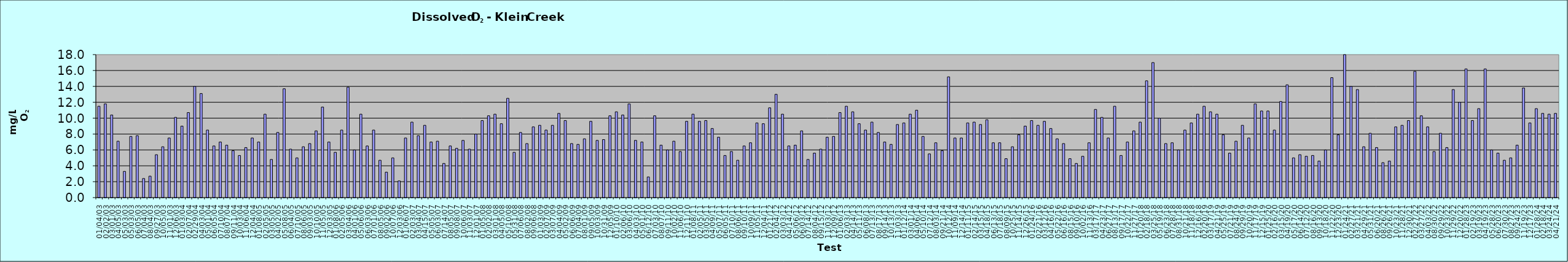
| Category | Series 0 |
|---|---|
| 2003-01-04 | 11.5 |
| 2003-02-02 | 11.8 |
| 2003-03-01 | 10.4 |
| 2003-04-05 | 7.1 |
| 2003-05-03 | 3.3 |
| 2003-05-03 | 7.7 |
| 2003-06-05 | 7.8 |
| 2003-07-04 | 2.4 |
| 2003-08-04 | 2.7 |
| 2003-09-27 | 5.4 |
| 2003-10-05 | 6.4 |
| 2003-11-01 | 7.5 |
| 2003-12-06 | 10.1 |
| 2004-01-03 | 9 |
| 2004-02-07 | 10.7 |
| 2004-02-29 | 14 |
| 2004-04-03 | 13.1 |
| 2004-05-01 | 8.5 |
| 2004-06-05 | 6.5 |
| 2004-07-10 | 7 |
| 2004-08-07 | 6.6 |
| 2004-09-11 | 5.9 |
| 2004-10-03 | 5.3 |
| 2004-11-06 | 6.3 |
| 2004-12-04 | 7.5 |
| 2005-01-08 | 7 |
| 2005-02-05 | 10.5 |
| 2005-03-05 | 4.8 |
| 2005-04-02 | 8.2 |
| 2005-05-08 | 13.7 |
| 2005-06-04 | 6.1 |
| 2005-07-10 | 5 |
| 2005-08-06 | 6.4 |
| 2005-09-03 | 6.8 |
| 2005-10-10 | 8.4 |
| 2005-11-05 | 11.4 |
| 2005-12-03 | 7 |
| 2006-01-08 | 5.7 |
| 2006-02-05 | 8.5 |
| 2006-03-04 | 13.9 |
| 2006-04-01 | 6 |
| 2006-05-06 | 10.5 |
| 2006-06-03 | 6.5 |
| 2006-07-01 | 8.5 |
| 2006-08-05 | 4.7 |
| 2006-09-02 | 3.2 |
| 2006-10-07 | 5 |
| 2006-12-03 | 2.1 |
| 2007-01-06 | 7.5 |
| 2007-02-03 | 9.5 |
| 2007-03-04 | 7.8 |
| 2007-04-15 | 9.1 |
| 2007-05-05 | 7 |
| 2007-06-03 | 7.1 |
| 2007-07-14 | 4.3 |
| 2007-08-05 | 6.5 |
| 2007-09-08 | 6.2 |
| 2007-10-06 | 7.2 |
| 2007-11-03 | 6.1 |
| 2007-12-01 | 8 |
| 2008-01-05 | 9.7 |
| 2008-02-02 | 10.3 |
| 2008-03-01 | 10.5 |
| 2008-04-05 | 9.3 |
| 2008-05-10 | 12.5 |
| 2008-05-31 | 5.7 |
| 2008-07-06 | 8.2 |
| 2008-08-02 | 6.8 |
| 2008-09-06 | 8.9 |
| 2009-01-03 | 9.1 |
| 2009-02-07 | 8.5 |
| 2009-03-07 | 9.1 |
| 2009-04-04 | 10.6 |
| 2009-05-02 | 9.7 |
| 2009-06-06 | 6.8 |
| 2009-07-04 | 6.7 |
| 2009-08-01 | 7.4 |
| 2009-09-05 | 9.6 |
| 2009-10-03 | 7.2 |
| 2009-10-31 | 7.3 |
| 2009-12-05 | 10.3 |
| 2010-01-10 | 10.8 |
| 2010-02-06 | 10.4 |
| 2010-03-06 | 11.8 |
| 2010-04-03 | 7.2 |
| 2010-05-01 | 7 |
| 2010-06-12 | 2.6 |
| 2010-07-03 | 10.3 |
| 2010-08-07 | 6.6 |
| 2010-09-11 | 6 |
| 2010-10-02 | 7.1 |
| 2010-11-06 | 5.8 |
| 2010-12-11 | 9.6 |
| 2011-01-08 | 10.5 |
| 2011-02-05 | 9.6 |
| 2011-03-05 | 9.7 |
| 2011-04-09 | 8.7 |
| 2011-05-07 | 7.6 |
| 2011-06-05 | 5.3 |
| 2011-07-10 | 5.8 |
| 2011-08-06 | 4.7 |
| 2011-09-10 | 6.5 |
| 2011-10-09 | 6.9 |
| 2011-11-05 | 9.4 |
| 2011-12-04 | 9.3 |
| 2012-01-21 | 11.3 |
| 2012-02-04 | 13 |
| 2012-03-03 | 10.5 |
| 2012-04-14 | 6.5 |
| 2012-05-06 | 6.6 |
| 2012-06-03 | 8.4 |
| 2012-07-14 | 4.8 |
| 2012-08-04 | 5.6 |
| 2012-09-15 | 6.1 |
| 2012-11-03 | 7.6 |
| 2012-12-09 | 7.7 |
| 2013-01-06 | 10.7 |
| 2013-02-03 | 11.5 |
| 2013-04-14 | 10.8 |
| 2013-05-11 | 9.3 |
| 2013-06-08 | 8.5 |
| 2013-07-13 | 9.5 |
| 2013-08-17 | 8.2 |
| 2013-09-14 | 7 |
| 2013-10-13 | 6.7 |
| 2013-11-03 | 9.2 |
| 2014-01-12 | 9.4 |
| 2014-03-01 | 10.5 |
| 2014-04-06 | 11 |
| 2014-05-10 | 7.7 |
| 2014-07-12 | 5.5 |
| 2014-08-03 | 6.9 |
| 2014-09-21 | 5.9 |
| 2014-10-12 | 15.2 |
| 2014-11-09 | 7.5 |
| 2014-12-14 | 7.5 |
| 2015-01-11 | 9.4 |
| 2015-02-14 | 9.5 |
| 2015-03-15 | 9.2 |
| 2015-04-18 | 9.8 |
| 2015-06-13 | 6.9 |
| 2015-07-18 | 6.9 |
| 2015-08-09 | 4.9 |
| 2015-10-25 | 6.4 |
| 2015-11-14 | 7.9 |
| 2015-12-26 | 9 |
| 2016-01-24 | 9.7 |
| 2016-02-21 | 9.1 |
| 2016-03-12 | 9.6 |
| 2016-04-16 | 8.7 |
| 2016-05-22 | 7.4 |
| 2016-06-16 | 6.8 |
| 2016-08-15 | 4.9 |
| 2016-09-10 | 4.3 |
| 2016-10-02 | 5.2 |
| 2016-11-13 | 6.9 |
| 2017-03-17 | 11.1 |
| 2017-04-23 | 10.1 |
| 2017-06-27 | 7.5 |
| 2017-08-13 | 11.5 |
| 2017-09-17 | 5.3 |
| 2017-10-22 | 7 |
| 2017-11-27 | 8.4 |
| 2018-01-20 | 9.5 |
| 2018-02-18 | 14.7 |
| 2018-03-25 | 17 |
| 2018-05-19 | 10 |
| 2018-06-23 | 6.8 |
| 2018-07-28 | 6.9 |
| 2018-08-31 | 6 |
| 2018-10-21 | 8.5 |
| 2018-11-18 | 9.4 |
| 2018-12-16 | 10.5 |
| 2019-02-20 | 11.5 |
| 2019-03-17 | 10.8 |
| 2019-04-21 | 10.5 |
| 2019-05-25 | 7.9 |
| 2019-07-21 | 5.6 |
| 2019-08-24 | 7.1 |
| 2019-09-29 | 9.1 |
| 2019-10-20 | 7.5 |
| 2019-11-17 | 11.8 |
| 2019-12-15 | 10.9 |
| 2020-01-25 | 10.9 |
| 2020-02-16 | 8.5 |
| 2020-03-15 | 12.1 |
| 2020-04-19 | 14.2 |
| 2020-05-17 | 5 |
| 2020-06-14 | 5.4 |
| 2020-07-12 | 5.2 |
| 2020-08-16 | 5.3 |
| 2020-09-13 | 4.6 |
| 2020-10-18 | 6 |
| 2020-11-22 | 15.1 |
| 2020-12-23 | 7.9 |
| 2021-01-24 | 18.6 |
| 2021-02-27 | 14 |
| 2021-03-21 | 13.6 |
| 2021-04-29 | 6.4 |
| 2021-05-31 | 8.1 |
| 2021-06-20 | 6.3 |
| 2021-08-26 | 4.4 |
| 2021-09-26 | 4.6 |
| 2021-10-23 | 8.9 |
| 2021-11-28 | 9.1 |
| 2021-12-30 | 9.7 |
| 2022-02-27 | 15.9 |
| 2022-03-27 | 10.3 |
| 2022-04-03 | 8.9 |
| 2022-08-30 | 5.8 |
| 2022-09-29 | 8.1 |
| 2022-10-23 | 6.3 |
| 2022-11-29 | 13.6 |
| 2022-12-20 | 12 |
| 2023-01-28 | 16.2 |
| 2023-02-19 | 9.7 |
| 2023-03-19 | 11.2 |
| 2023-04-19 | 16.2 |
| 2023-05-28 | 6 |
| 2023-06-20 | 5.6 |
| 2023-07-30 | 4.7 |
| 2023-08-27 | 5 |
| 2023-09-24 | 6.6 |
| 2023-11-19 | 13.8 |
| 2023-12-17 | 9.4 |
| 2024-01-28 | 11.2 |
| 2024-02-18 | 10.6 |
| 2024-03-24 | 10.5 |
| 2024-04-21 | 10.6 |